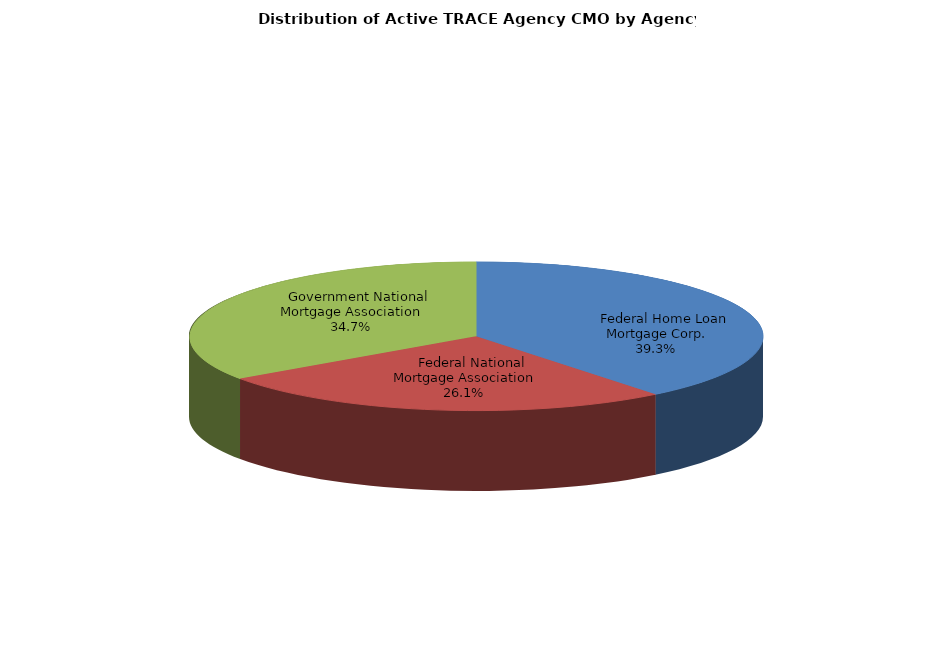
| Category | Series 0 |
|---|---|
|     Federal Home Loan Mortgage Corp. | 100313 |
|     Federal National Mortgage Association | 66684 |
|     Government National Mortgage Association | 88552 |